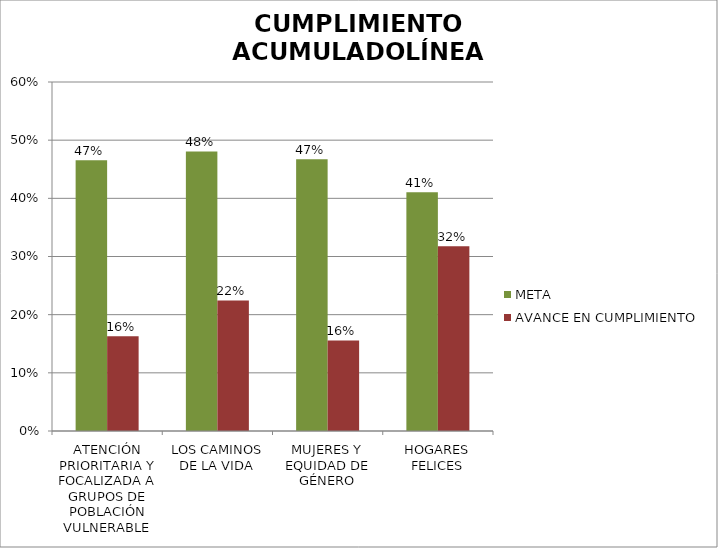
| Category | META | AVANCE EN CUMPLIMIENTO |
|---|---|---|
| ATENCIÓN PRIORITARIA Y FOCALIZADA A GRUPOS DE POBLACIÓN VULNERABLE | 0.465 | 0.163 |
| LOS CAMINOS DE LA VIDA | 0.481 | 0.225 |
| MUJERES Y EQUIDAD DE GÉNERO | 0.467 | 0.156 |
| HOGARES FELICES | 0.41 | 0.317 |